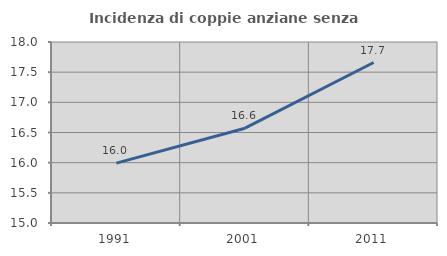
| Category | Incidenza di coppie anziane senza figli  |
|---|---|
| 1991.0 | 15.993 |
| 2001.0 | 16.571 |
| 2011.0 | 17.66 |